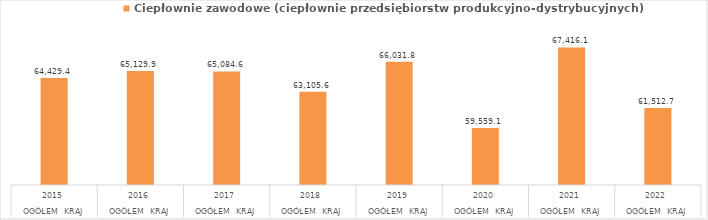
| Category | Ciepłownie zawodowe (ciepłownie przedsiębiorstw produkcyjno-dystrybucyjnych) |
|---|---|
| 0 | 64429.4 |
| 1 | 65129.9 |
| 2 | 65084.6 |
| 3 | 63105.6 |
| 4 | 66031.8 |
| 5 | 59559.1 |
| 6 | 67416.1 |
| 7 | 61512.7 |